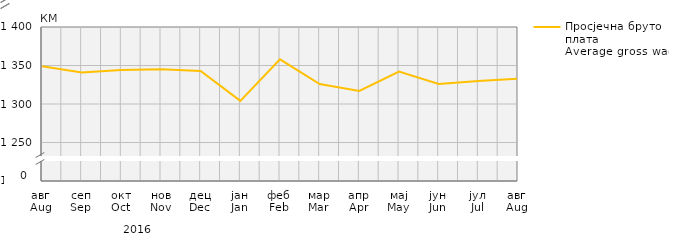
| Category | Просјечна бруто плата
Average gross wage |
|---|---|
| авг
Aug | 1349 |
| сеп
Sep | 1341 |
| окт
Oct | 1344 |
| нов
Nov | 1345 |
| дец
Dec | 1343 |
| јан
Jan | 1304 |
| феб
Feb | 1358 |
| мар
Mar | 1326 |
| апр
Apr | 1317 |
| мај
May | 1342 |
| јун
Jun | 1326 |
| јул
Jul | 1330 |
| авг
Aug | 1333 |